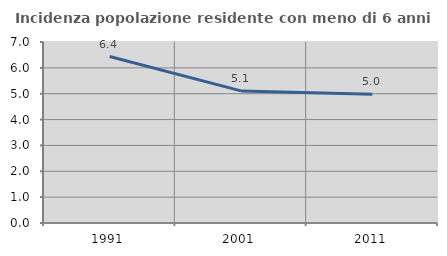
| Category | Incidenza popolazione residente con meno di 6 anni |
|---|---|
| 1991.0 | 6.436 |
| 2001.0 | 5.109 |
| 2011.0 | 4.976 |